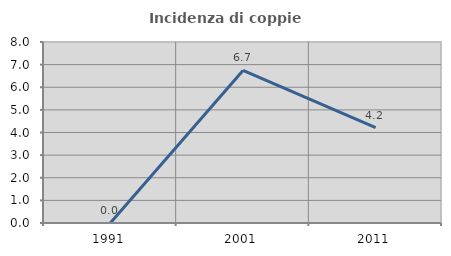
| Category | Incidenza di coppie miste |
|---|---|
| 1991.0 | 0 |
| 2001.0 | 6.742 |
| 2011.0 | 4.211 |